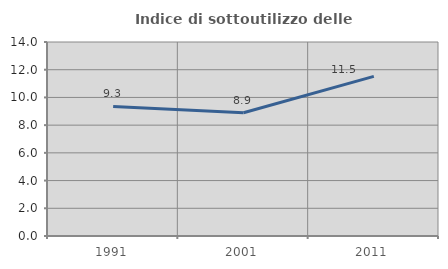
| Category | Indice di sottoutilizzo delle abitazioni  |
|---|---|
| 1991.0 | 9.348 |
| 2001.0 | 8.89 |
| 2011.0 | 11.519 |